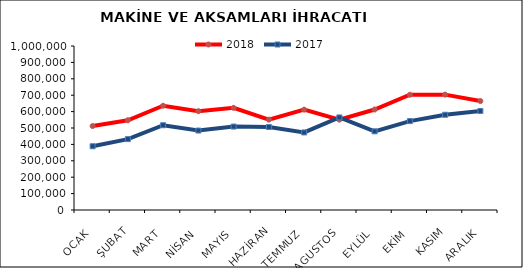
| Category | 2018 | 2017 |
|---|---|---|
| OCAK | 511896.462 | 388710.507 |
| ŞUBAT | 547347.89 | 432230.301 |
| MART | 635721.993 | 516939.841 |
| NİSAN | 602468.41 | 484507.63 |
| MAYIS | 622870.84 | 508707.002 |
| HAZİRAN | 551038.229 | 505991.599 |
| TEMMUZ | 611763.924 | 472926.826 |
| AGUSTOS | 550943.698 | 564409.019 |
| EYLÜL | 612789.299 | 479730.972 |
| EKİM | 702629.831 | 542054.697 |
| KASIM | 703370.304 | 580685.434 |
| ARALIK | 664266.359 | 603670.95 |